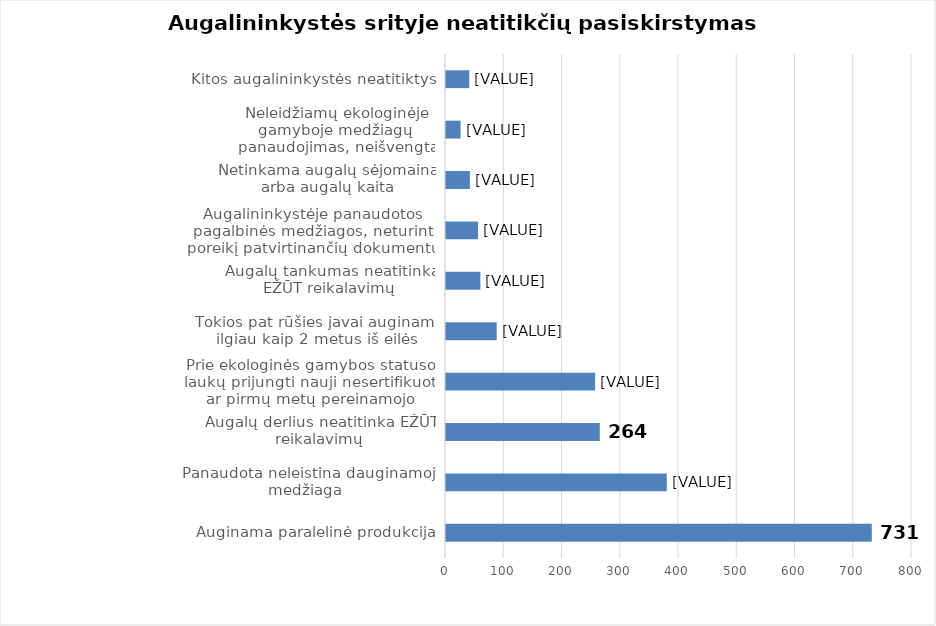
| Category | 2021 m. |
|---|---|
| Auginama paralelinė produkcija | 731 |
| Panaudota neleistina dauginamoji medžiaga  | 379 |
| Augalų derlius neatitinka EŽŪT reikalavimų | 264 |
| Prie ekologinės gamybos statuso laukų prijungti nauji nesertifikuoti ar pirmų metų pereinamojo laikotarpio laukai | 256 |
| Tokios pat rūšies javai auginami ilgiau kaip 2 metus iš eilės | 87 |
| Augalų tankumas neatitinka EŽŪT reikalavimų | 59 |
| Augalininkystėje panaudotos pagalbinės medžiagos, neturint poreikį patvirtinančių dokumentų | 55 |
| Netinkama augalų sėjomaina arba augalų kaita | 41 |
| Neleidžiamų ekologinėje gamyboje medžiagų  panaudojimas, neišvengta užteršimo cheminėmis medžiagomis | 25 |
| Kitos augalininkystės neatitiktys | 40 |